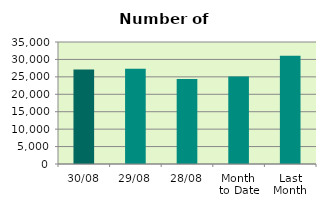
| Category | Series 0 |
|---|---|
| 30/08 | 27114 |
| 29/08 | 27332 |
| 28/08 | 24364 |
| Month 
to Date | 25135.091 |
| Last
Month | 31061.545 |